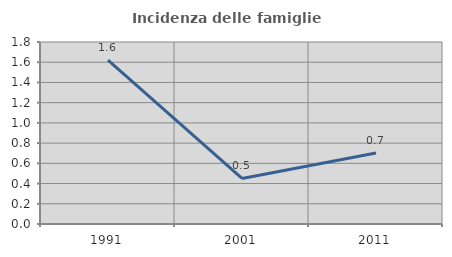
| Category | Incidenza delle famiglie numerose |
|---|---|
| 1991.0 | 1.622 |
| 2001.0 | 0.45 |
| 2011.0 | 0.702 |